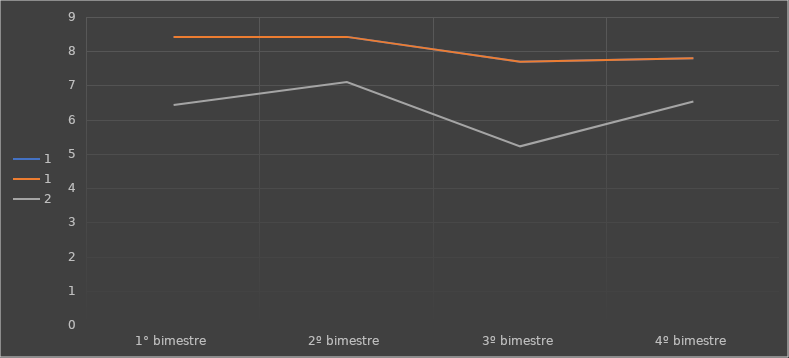
| Category | 1 | 2 |
|---|---|---|
| 1° bimestre | 8.419 | 6.426 |
| 2º bimestre | 8.419 | 7.1 |
| 3º bimestre | 7.689 | 5.221 |
| 4º bimestre | 7.798 | 6.529 |